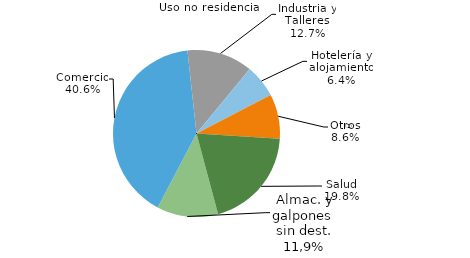
| Category | Series 0 |
|---|---|
| Almac. y galpones sin dest. | 9943 |
| Comercio | 34023 |
| Industria y Talleres | 10653 |
| Hotelería y alojamiento | 5374 |
| Otros | 7207.29 |
| Salud | 16640 |